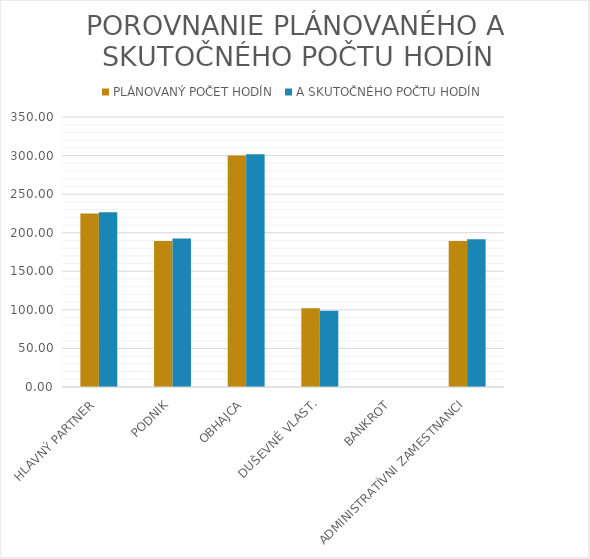
| Category | PLÁNOVANÝ POČET HODÍN | A SKUTOČNÉHO POČTU HODÍN |
|---|---|---|
| HLAVNÝ PARTNER | 225 | 226.5 |
| PODNIK | 189.286 | 192.5 |
| OBHAJCA | 300 | 301.714 |
| DUŠEVNÉ VLAST. | 102.143 | 99 |
| BANKROT | 0 | 0 |
| ADMINISTRATÍVNI ZAMESTNANCI | 189.286 | 191.429 |